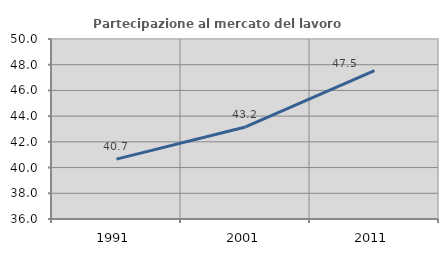
| Category | Partecipazione al mercato del lavoro  femminile |
|---|---|
| 1991.0 | 40.656 |
| 2001.0 | 43.157 |
| 2011.0 | 47.541 |